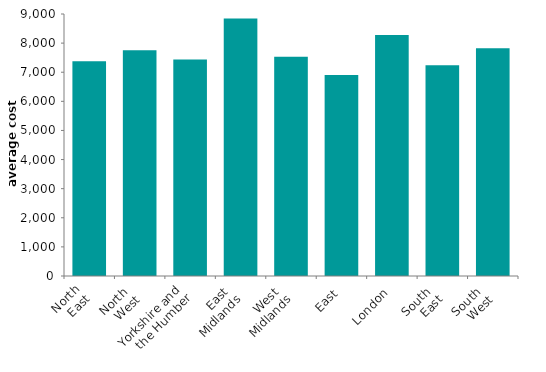
| Category | Series 0 |
|---|---|
| North
 East | 7380.15 |
| North 
West | 7753.082 |
| Yorkshire and
 the Humber | 7438.563 |
| East 
Midlands | 8848.601 |
| West 
Midlands | 7531.502 |
| East | 6901.9 |
| London | 8281.337 |
| South 
East | 7239.261 |
| South 
West | 7821.222 |